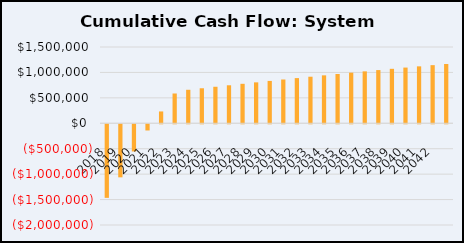
| Category | Cumulative Cash Flow |
|---|---|
| 2018.0 | -1446516.482 |
| 2019.0 | -1043133.26 |
| 2020.0 | -534680.634 |
| 2021.0 | -121670.731 |
| 2022.0 | 232751.162 |
| 2023.0 | 585817.618 |
| 2024.0 | 658867.984 |
| 2025.0 | 688633.265 |
| 2026.0 | 718113.077 |
| 2027.0 | 747298.857 |
| 2028.0 | 776181.783 |
| 2029.0 | 804752.771 |
| 2030.0 | 833002.462 |
| 2031.0 | 860921.217 |
| 2032.0 | 888499.108 |
| 2033.0 | 915725.909 |
| 2034.0 | 942591.088 |
| 2035.0 | 969083.795 |
| 2036.0 | 995192.857 |
| 2037.0 | 1020906.764 |
| 2038.0 | 1046213.662 |
| 2039.0 | 1071101.34 |
| 2040.0 | 1095557.222 |
| 2041.0 | 1119568.354 |
| 2042.0 | 1143121.393 |